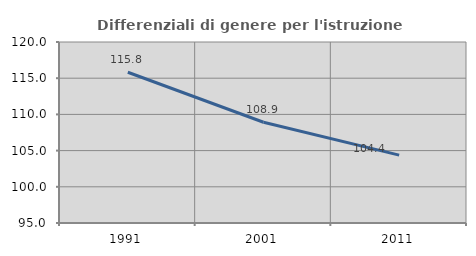
| Category | Differenziali di genere per l'istruzione superiore |
|---|---|
| 1991.0 | 115.819 |
| 2001.0 | 108.917 |
| 2011.0 | 104.38 |